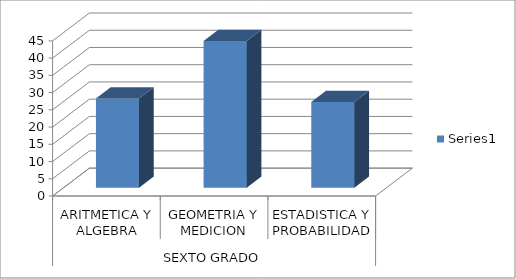
| Category | Series 0 |
|---|---|
| 0 | 25.86 |
| 1 | 42.54 |
| 2 | 24.84 |